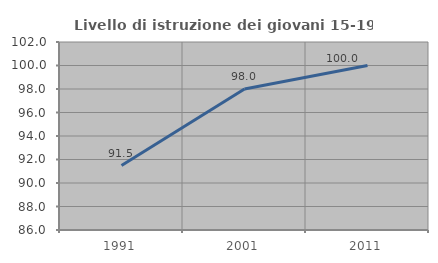
| Category | Livello di istruzione dei giovani 15-19 anni |
|---|---|
| 1991.0 | 91.489 |
| 2001.0 | 98 |
| 2011.0 | 100 |